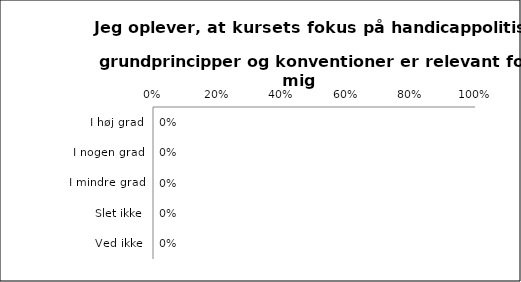
| Category | Kursts fokus på handicappolitiske grundprincipper og konventioner er relevant for mig |
|---|---|
| I høj grad | 0 |
| I nogen grad | 0 |
| I mindre grad | 0 |
| Slet ikke | 0 |
| Ved ikke | 0 |